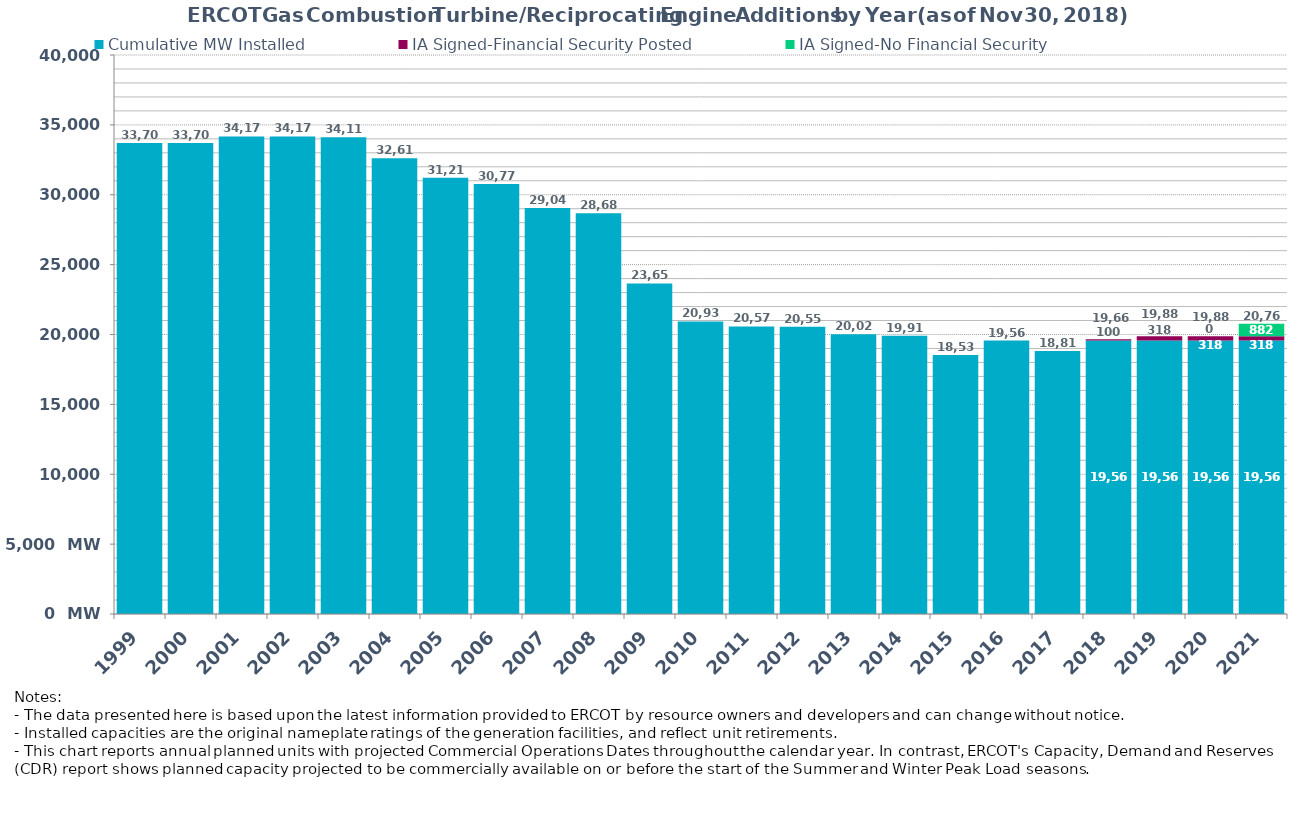
| Category | Cumulative MW Installed | IA Signed-Financial Security Posted  | IA Signed-No Financial Security  | Cumulative Installed and Planned |
|---|---|---|---|---|
| 1999.0 | 33703 | 0 | 0 | 33703 |
| 2000.0 | 33703 | 0 | 0 | 33703 |
| 2001.0 | 34170 | 0 | 0 | 34170 |
| 2002.0 | 34170 | 0 | 0 | 34170 |
| 2003.0 | 34118 | 0 | 0 | 34118 |
| 2004.0 | 32616 | 0 | 0 | 32616 |
| 2005.0 | 31217 | 0 | 0 | 31217 |
| 2006.0 | 30774 | 0 | 0 | 30774 |
| 2007.0 | 29048 | 0 | 0 | 29048 |
| 2008.0 | 28681 | 0 | 0 | 28681 |
| 2009.0 | 23651 | 0 | 0 | 23651 |
| 2010.0 | 20937 | 0 | 0 | 20937 |
| 2011.0 | 20575 | 0 | 0 | 20575 |
| 2012.0 | 20551 | 0 | 0 | 20551 |
| 2013.0 | 20026 | 0 | 0 | 20026 |
| 2014.0 | 19917 | 0 | 0 | 19917 |
| 2015.0 | 18538 | 0 | 0 | 18538 |
| 2016.0 | 19564 | 0 | 0 | 19564 |
| 2017.0 | 18818 | 0 | 0 | 18818 |
| 2018.0 | 19562 | 100 | 0 | 19662 |
| 2019.0 | 19562 | 318 | 0 | 19880 |
| 2020.0 | 19562 | 318 | 0 | 19880 |
| 2021.0 | 19562 | 318 | 881.8 | 20761.8 |